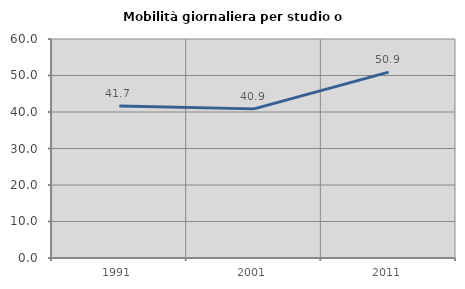
| Category | Mobilità giornaliera per studio o lavoro |
|---|---|
| 1991.0 | 41.667 |
| 2001.0 | 40.856 |
| 2011.0 | 50.928 |